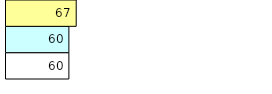
| Category | Total Standouts | Total Recd | Total Tipsters |
|---|---|---|---|
| 0 | 60 | 60 | 67 |